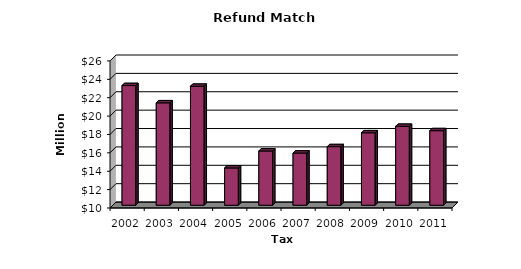
| Category | Total |
|---|---|
| 2002.0 | 23.014 |
| 2003.0 | 21.137 |
| 2004.0 | 22.937 |
| 2005.0 | 14.052 |
| 2006.0 | 15.896 |
| 2007.0 | 15.673 |
| 2008.0 | 16.367 |
| 2009.0 | 17.876 |
| 2010.0 | 18.578 |
| 2011.0 | 18.105 |